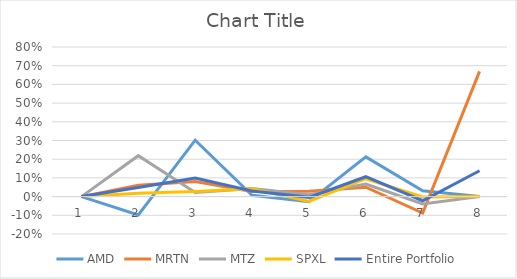
| Category | AMD | MRTN | MTZ | SPXL | Entire Portfolio |
|---|---|---|---|---|---|
| 0 | 0 | 0 | 0 | 0 | 0 |
| 1 | -0.098 | 0.061 | 0.219 | 0.018 | 0.049 |
| 2 | 0.302 | 0.08 | 0.022 | 0.028 | 0.099 |
| 3 | 0.007 | 0.028 | 0.044 | 0.042 | 0.03 |
| 4 | -0.027 | 0.029 | 0.009 | -0.026 | -0.004 |
| 5 | 0.212 | 0.05 | 0.067 | 0.096 | 0.106 |
| 6 | 0.031 | -0.088 | -0.039 | -0.002 | -0.022 |
| 7 | 0 | 0.669 | 0 | 0 | 0.138 |